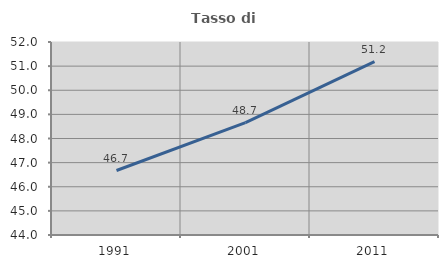
| Category | Tasso di occupazione   |
|---|---|
| 1991.0 | 46.673 |
| 2001.0 | 48.662 |
| 2011.0 | 51.189 |